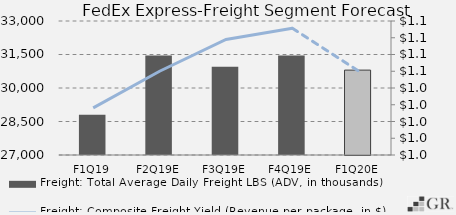
| Category | Freight: Total Average Daily Freight LBS (ADV, in thousands) |
|---|---|
|  F1Q19  | 28800 |
|  F2Q19E  | 31450.941 |
|  F3Q19E  | 30948.818 |
|  F4Q19E  | 31450.849 |
|  F1Q20E  | 30801.082 |